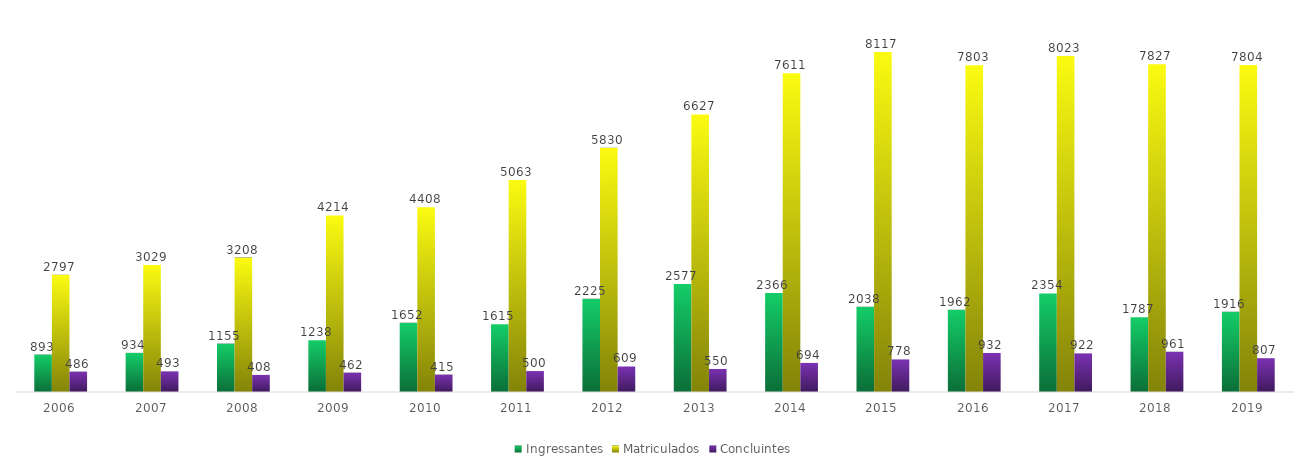
| Category | Ingressantes | Matriculados | Concluintes |
|---|---|---|---|
| 2006.0 | 893 | 2797 | 486 |
| 2007.0 | 934 | 3029 | 493 |
| 2008.0 | 1155 | 3208 | 408 |
| 2009.0 | 1238 | 4214 | 462 |
| 2010.0 | 1652 | 4408 | 415 |
| 2011.0 | 1615 | 5063 | 500 |
| 2012.0 | 2225 | 5830 | 609 |
| 2013.0 | 2577 | 6627 | 550 |
| 2014.0 | 2366 | 7611 | 694 |
| 2015.0 | 2038 | 8117 | 778 |
| 2016.0 | 1962 | 7803 | 932 |
| 2017.0 | 2354 | 8023 | 922 |
| 2018.0 | 1787 | 7827 | 961 |
| 2019.0 | 1916 | 7804 | 807 |